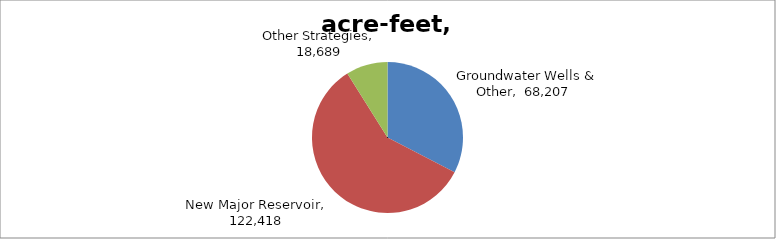
| Category | Series 0 |
|---|---|
| Groundwater Wells & Other | 68207 |
| New Major Reservoir | 122418 |
| Other Strategies | 18689 |